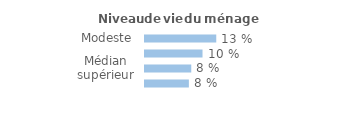
| Category | Series 0 |
|---|---|
| Modeste | 0.128 |
| Médian inférieur | 0.103 |
| Médian supérieur | 0.083 |
| Aisé | 0.079 |